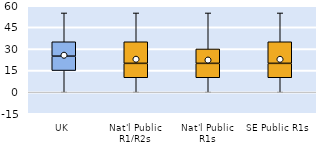
| Category | 25th | 50th | 75th |
|---|---|---|---|
| UK | 15 | 10 | 10 |
| Nat'l Public R1/R2s | 10 | 10 | 15 |
| Nat'l Public R1s | 10 | 10 | 10 |
| SE Public R1s | 10 | 10 | 15 |